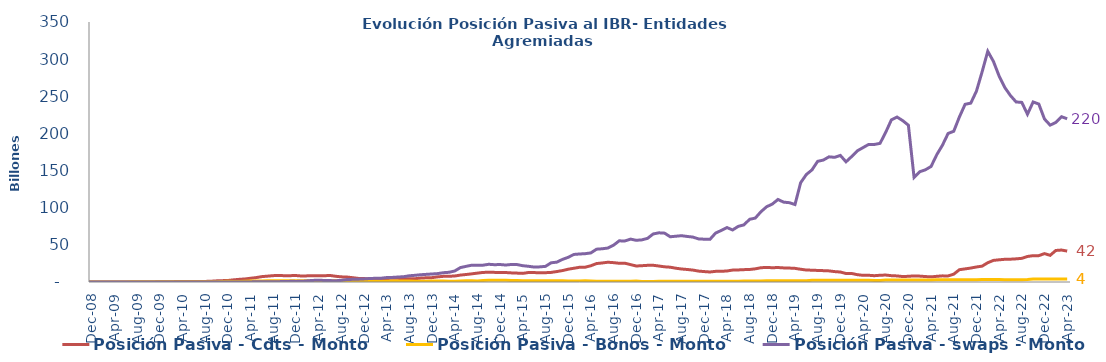
| Category | Posición Pasiva - Cdts - Monto | Posición Pasiva - Bonos - Monto | Posición Pasiva - swaps - Monto |
|---|---|---|---|
| 2008-07-01 | 0 | 0 | 0 |
| 2008-08-01 | 0 | 0 | 0 |
| 2008-09-01 | 1000000 | 0 | 0 |
| 2008-10-01 | 1000000 | 0 | 0 |
| 2008-11-01 | 0 | 0 | 0 |
| 2008-12-01 | 0 | 0 | 0 |
| 2009-01-01 | 0 | 0 | 0 |
| 2009-02-01 | 0 | 0 | 0 |
| 2009-03-01 | 0 | 0 | 0 |
| 2009-04-01 | 0 | 0 | 0 |
| 2009-05-01 | 0 | 0 | 0 |
| 2009-06-01 | 0 | 0 | 0 |
| 2009-07-01 | 0 | 177200000000 | 0 |
| 2009-08-01 | 0 | 177200000000 | 0 |
| 2009-09-01 | 0 | 177200000000 | 0 |
| 2009-10-01 | 1000000 | 177200000000 | 0 |
| 2009-11-01 | 133701000000 | 177200000000 | 0 |
| 2009-12-01 | 307701000000 | 177200000000 | 700000000 |
| 2010-01-01 | 320201000000 | 177200000000 | 2600000000 |
| 2010-02-01 | 357551000000 | 177200000000 | 3500000000 |
| 2010-03-01 | 655371000000 | 192000000000 | 19200000000 |
| 2010-04-01 | 675721000000 | 192000000000 | 34200000000 |
| 2010-05-01 | 681721000000 | 192000000000 | 51500000000 |
| 2010-06-01 | 705721000000 | 205600000000 | 50500000000 |
| 2010-07-01 | 737221000000 | 205600000000 | 40000000000 |
| 2010-08-01 | 785721000000 | 205600000000 | 39000000000 |
| 2010-09-01 | 1033321000000 | 205600000000 | 55000000000 |
| 2010-10-01 | 1530639000000 | 392650000000 | 52000000000 |
| 2010-11-01 | 1811289030230 | 743290000000 | 58000000000 |
| 2010-12-01 | 2062699030230 | 962710000000 | 66000000000 |
| 2011-01-01 | 2879749030230 | 807496000000 | 89000000000 |
| 2011-02-01 | 3592057311520 | 807496000000 | 121000000000 |
| 2011-03-01 | 4094394311520 | 994310000000 | 109000000000 |
| 2011-04-01 | 5034075281290 | 1342146000000 | 153000000000 |
| 2011-05-01 | 5963198881774 | 1342146000000 | 197000000000 |
| 2011-06-01 | 7250771346191 | 1342146000000 | 367000000000 |
| 2011-07-01 | 7889921570652 | 1675923000000 | 437000000000 |
| 2011-08-01 | 8556448085668 | 1578873000000 | 462000000000 |
| 2011-09-01 | 8833885282168 | 1635362000000 | 475000000000 |
| 2011-10-01 | 8457699585668 | 1767199000000 | 614000000000 |
| 2011-11-01 | 8549620287184 | 1767199000000 | 875000000000 |
| 2011-12-01 | 8705544763684 | 1767199000000 | 833000000000 |
| 2012-01-01 | 8049489811238 | 1767199000000 | 876000000000 |
| 2012-02-01 | 8270462411238 | 1767199000000 | 1563000000000 |
| 2012-03-01 | 8518277207338 | 1737198999996 | 2146000000000 |
| 2012-04-01 | 8443527467338 | 1737199000000 | 2394500000000 |
| 2012-05-01 | 8450299073338 | 1760649000000 | 2078750000000 |
| 2012-06-01 | 8778980763536 | 1608181000000 | 1904350000000 |
| 2012-07-01 | 7700629135460 | 1608181000000 | 1698707000000 |
| 2012-08-01 | 6932102972154 | 1608181000000 | 2198807000000 |
| 2012-09-01 | 6675552972154 | 1608181000000 | 3297552000000 |
| 2012-10-01 | 5825952472154 | 1516631000000 | 3592517000000 |
| 2012-11-01 | 4826904430154 | 1510256000000 | 3782805083331 |
| 2012-12-01 | 4650075554154 | 1509355000000 | 4185362081845 |
| 2013-01-01 | 4016525414921 | 1509354931416.67 | 4692538642439 |
| 2013-02-01 | 4272243181883 | 1147770000000 | 4990298764579 |
| 2013-03-01 | 4558993181883 | 1113970000000 | 5067351034108 |
| 2013-04-01 | 4748821181883 | 1159013000000 | 6003435133053 |
| 2013-05-01 | 5020504181883 | 1390113000000 | 6169552742390.75 |
| 2013-06-01 | 4908852681883 | 1300113000000 | 6705676089087.75 |
| 2013-07-01 | 4542666412950 | 1300097600000 | 7144037698575.75 |
| 2013-08-01 | 4538035699500 | 1259904100000 | 8418505206190.25 |
| 2013-09-01 | 4426905198533 | 1015652000000 | 8994300517255.25 |
| 2013-10-01 | 5259004198533 | 923402000000 | 9766983899621.8 |
| 2013-11-01 | 5660733384614 | 974762000000 | 10300441787153.8 |
| 2013-12-01 | 5893893284614 | 1235400000000 | 10801537325169.8 |
| 2014-01-01 | 6933122579068 | 1235400000000 | 11307303837792.8 |
| 2014-02-01 | 7613677579068 | 1235400000000 | 12524983899621.8 |
| 2014-03-01 | 7717362579068 | 936600000000 | 13071266927788.8 |
| 2014-04-01 | 8082318579068 | 1057300000000 | 14850725938985.8 |
| 2014-05-01 | 9299683175517 | 1439566000000 | 19403141857606.23 |
| 2014-06-01 | 10084195252517 | 1550812908000 | 21076466392867.23 |
| 2014-07-01 | 10972302777723 | 1550417621000 | 22642710423754.09 |
| 2014-08-01 | 11972062686643 | 1337912000000 | 22412814812363.438 |
| 2014-09-01 | 12905707081780.31 | 2154227000000 | 22678622315786.43 |
| 2014-10-01 | 13063246210954.844 | 2244227000000 | 23852851304721.203 |
| 2014-11-01 | 12953854419948.99 | 2244227000000 | 23294758403938.21 |
| 2014-12-01 | 12797175147981.03 | 2244227000000 | 23527533950320.21 |
| 2015-01-01 | 12735464045472.7 | 2244227000000 | 22844089310976.43 |
| 2015-02-01 | 12258740520049.02 | 1967427000000 | 23616016822770.98 |
| 2015-03-01 | 11959675084873.94 | 1922546000000 | 23429845881131.43 |
| 2015-04-01 | 11603104146348.63 | 1731531000000 | 21954905217570.633 |
| 2015-05-01 | 12787258765586.06 | 1731531000000 | 21137165704294.71 |
| 2015-06-01 | 12702350124119.61 | 1731531000000 | 20116838167751.242 |
| 2015-07-01 | 12326873613850.61 | 1731531000000 | 20375523033390.5 |
| 2015-08-01 | 12532631352445.61 | 1731531000000 | 21044174373204.39 |
| 2015-09-01 | 12914314312021.61 | 1731531000000 | 25886053422220.67 |
| 2015-10-01 | 14078324826522.61 | 1731531000000 | 26724546866995.008 |
| 2015-11-01 | 15387895261461.13 | 1790331000000 | 30433131895803.133 |
| 2015-12-01 | 17198106299339.13 | 1474516000000 | 33218498858606.953 |
| 2016-01-01 | 18471252279786.94 | 1474516000000 | 37083234558973.01 |
| 2016-02-01 | 19820074498199.3 | 1474516000000 | 37698368402074.71 |
| 2016-03-01 | 19910995635360.5 | 1559516000000 | 38121885099841.87 |
| 2016-04-01 | 21872523250119.66 | 1466816000000 | 39141783058519.24 |
| 2016-05-01 | 24813127348002.38 | 1059116000000 | 44164977934302.15 |
| 2016-06-01 | 25637146394228.258 | 1059116000000 | 44728113292988.33 |
| 2016-07-01 | 26607711640580.258 | 1059116000000 | 45705606091662.73 |
| 2016-08-01 | 26048927395012.82 | 1059116000000 | 49517526483113.3 |
| 2016-09-01 | 25202974900085.754 | 1059787036612.9 | 55398854669509.74 |
| 2016-10-01 | 25284571899756.367 | 1151562066774.19 | 55242666617988.44 |
| 2016-11-01 | 23434547096864.77 | 1150981261774.19 | 57761956184631.16 |
| 2016-12-01 | 21535959293189.84 | 1501604591451.61 | 56119119443202.05 |
| 2017-01-01 | 21950343369064.71 | 700243000000 | 56716284030347.41 |
| 2017-02-01 | 22437913541124.71 | 700243000000 | 58757499650223.12 |
| 2017-03-01 | 22508699373693.71 | 700243000000 | 64704229108276.48 |
| 2017-04-01 | 21508774970839.19 | 1133243000000 | 66211606669941.06 |
| 2017-05-01 | 20451439388511.71 | 1068411000000 | 65777253859007.76 |
| 2017-06-01 | 19911066434349.71 | 1068411000000 | 60894933619234.93 |
| 2017-07-01 | 18525251185322.71 | 976568000000 | 61635888515859.08 |
| 2017-08-01 | 17501216922547.781 | 976568000000 | 62349645714459.99 |
| 2017-09-01 | 16861503696848.07 | 891568000000 | 61287373903049.51 |
| 2017-10-01 | 16033651202236.707 | 891568000000 | 60491496582725.68 |
| 2017-11-01 | 14663855718312.71 | 891568000000 | 57968503538179.62 |
| 2017-12-01 | 14029447776466.201 | 891568000000 | 57632652407339.234 |
| 2018-01-01 | 13473477511044.71 | 891568000000 | 57392798372781.125 |
| 2018-02-01 | 14345353584382.71 | 891568000000 | 65871665857879.45 |
| 2018-03-01 | 14384191776904.707 | 891568000000 | 69411275754893.83 |
| 2018-04-01 | 14844263302225.71 | 918568000000 | 73289911574145.83 |
| 2018-05-01 | 16052886454266.71 | 1118568000000 | 70046783961295.945 |
| 2018-06-01 | 16243945147454.24 | 1118568000000 | 74916667687352.02 |
| 2018-07-01 | 16635494229855.71 | 1407568000000 | 76887213001782.36 |
| 2018-08-01 | 16851916145165.71 | 1261500000000 | 84402981257829.3 |
| 2018-09-01 | 17741041145165.71 | 1259000000000 | 86020631843693.48 |
| 2018-10-01 | 19205478628953.5 | 1258999999164.99 | 94613317771893.92 |
| 2018-11-01 | 19659598677128.79 | 1627030000000 | 101300492312826.36 |
| 2018-12-01 | 19206685075128.79 | 1627030000000 | 104883673702985.12 |
| 2019-01-01 | 19486763643454.664 | 1627030000000 | 111103390660546.89 |
| 2019-02-01 | 18970941687646.89 | 1627030000000 | 107501227199297.78 |
| 2019-03-01 | 18754890853470.266 | 1627030000000 | 106776186595081.17 |
| 2019-04-01 | 18347443914782.69 | 1654830000000 | 104284947187587.81 |
| 2019-05-01 | 17157834496300 | 1627030000000 | 133658510077641.11 |
| 2019-06-01 | 16128373592479.15 | 1627030000000 | 144665517254733.94 |
| 2019-07-01 | 15902851646300 | 2284030000000 | 150930692755760.22 |
| 2019-08-01 | 15563560011866.97 | 2284030000000 | 162448663120908.5 |
| 2019-09-01 | 15288853777637 | 2284030000000 | 164146968295123.03 |
| 2019-10-01 | 14962283507837 | 2284030000000 | 168498536410506.4 |
| 2019-11-01 | 13992481472649.271 | 2284030000000 | 167832819482332.1 |
| 2019-12-01 | 13437389275848.19 | 2284030000000 | 170403680265263.12 |
| 2020-01-01 | 11427969275848.19 | 2284030000000 | 161796326952048.56 |
| 2020-02-01 | 11486309350848.2 | 2284030000000 | 168924461024196.16 |
| 2020-03-01 | 9858189231848.2 | 2284030000000 | 176600885670577.38 |
| 2020-04-01 | 8983923528595.2 | 2284030000000 | 180918183400137.44 |
| 2020-05-01 | 9040383328595.2 | 2284030000000 | 185227294784495.6 |
| 2020-06-01 | 8484583328595.2 | 2035030000000 | 185160540118725.53 |
| 2020-07-01 | 9072883328595.2 | 2035030000000 | 186643702571650.72 |
| 2020-08-01 | 9360862343547.2 | 2545570000000 | 201480505268442.7 |
| 2020-09-01 | 8526917646747.2 | 2679670000000 | 218256002947901.9 |
| 2020-10-01 | 8171213350000.2 | 2679670000000 | 222001938774846.72 |
| 2020-11-01 | 7320013150000.2 | 2529670000000 | 217222368556622.78 |
| 2020-12-01 | 7673394000000.2 | 2529670000000 | 211083541414183.53 |
| 2021-01-01 | 8198408491318 | 2679670000000 | 140860140344279.03 |
| 2021-02-01 | 7915994323218 | 2679670000000 | 148470963624772.75 |
| 2021-03-01 | 7338678229860.2 | 2677670000000 | 151046613974426.25 |
| 2021-04-01 | 6886055406056 | 2677670000000 | 155523123340958.16 |
| 2021-05-01 | 7659313032853.58 | 2914344000000 | 171272470178961.16 |
| 2021-06-01 | 8257182332501.91 | 2914344000000 | 184041194712615.56 |
| 2021-07-01 | 8159859576450.46 | 2914344000000 | 199914074187254.25 |
| 2021-08-01 | 10552978524859.92 | 2884844000000 | 202937186689274.28 |
| 2021-09-01 | 16587850051344.59 | 3161903000000 | 222253400675870.16 |
| 2021-10-01 | 17653099243178.52 | 3161203000000 | 239192576457238.72 |
| 2021-11-01 | 18776840079638.598 | 3133368000000 | 240752173742020.22 |
| 2021-12-01 | 20244039670715.29 | 3133368000000 | 256893961511020.3 |
| 2022-01-01 | 21343078679201.027 | 3217059000000 | 282910313994579.56 |
| 2022-02-01 | 25968390803383.117 | 3217059000000 | 310582521181853.25 |
| 2022-03-01 | 29079278826500.91 | 3402629000000 | 296902766470543.1 |
| 2022-04-01 | 29878508700904.168 | 3402629000000 | 277234983700485.12 |
| 2022-05-01 | 30556974853568.58 | 3119762000000 | 261834697484694.28 |
| 2022-06-01 | 30698098080978.74 | 3119762000000 | 250959204747603.47 |
| 2022-07-01 | 31169358943510.74 | 3119762000000 | 242343093219276.25 |
| 2022-08-01 | 31843118892391 | 3119762000000 | 241800616461728.94 |
| 2022-09-01 | 34381583843362.164 | 3455412083000 | 225836251604886.94 |
| 2022-10-01 | 35438218775919.164 | 4105355738000 | 242363667095934.44 |
| 2022-11-01 | 35486350574068.164 | 4112855738000 | 239539971126314.25 |
| 2022-12-01 | 38219285981583.71 | 4143855738000 | 219408926835381.38 |
| 2023-01-01 | 35905454983232 | 4152068571000 | 211137954473393.66 |
| 2023-02-01 | 42457764899185.41 | 4162068571000 | 214777313652218.3 |
| 2023-03-01 | 43021386300809.94 | 4169068571000 | 222501181577358.22 |
| 2023-04-01 | 41625538007037.83 | 4171524464000 | 219742149861380.38 |